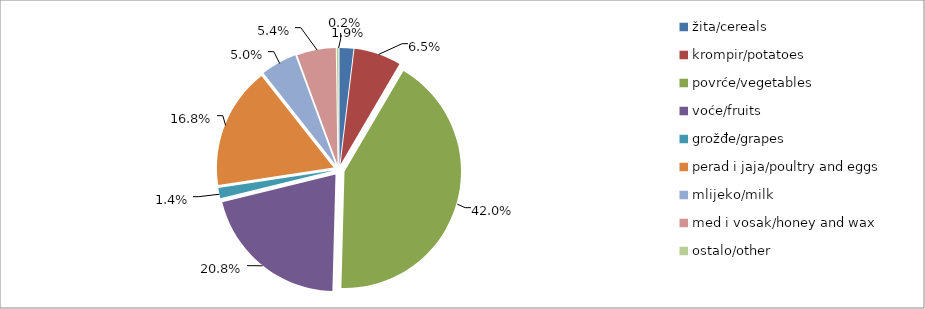
| Category | Series 0 |
|---|---|
| žita/cereals | 15794 |
| krompir/potatoes | 53648 |
| povrće/vegetables | 345423 |
| voće/fruits | 170827 |
| grožđe/grapes | 11630 |
| perad i jaja/poultry and eggs | 138118 |
| mlijeko/milk | 41108 |
| med i vosak/honey and wax | 44232 |
| ostalo/other | 1940 |